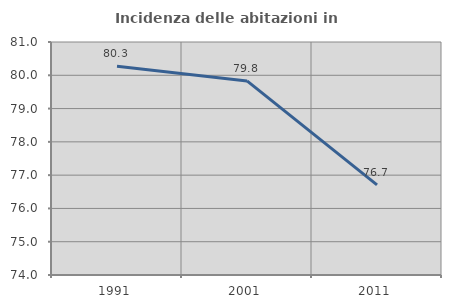
| Category | Incidenza delle abitazioni in proprietà  |
|---|---|
| 1991.0 | 80.275 |
| 2001.0 | 79.831 |
| 2011.0 | 76.708 |